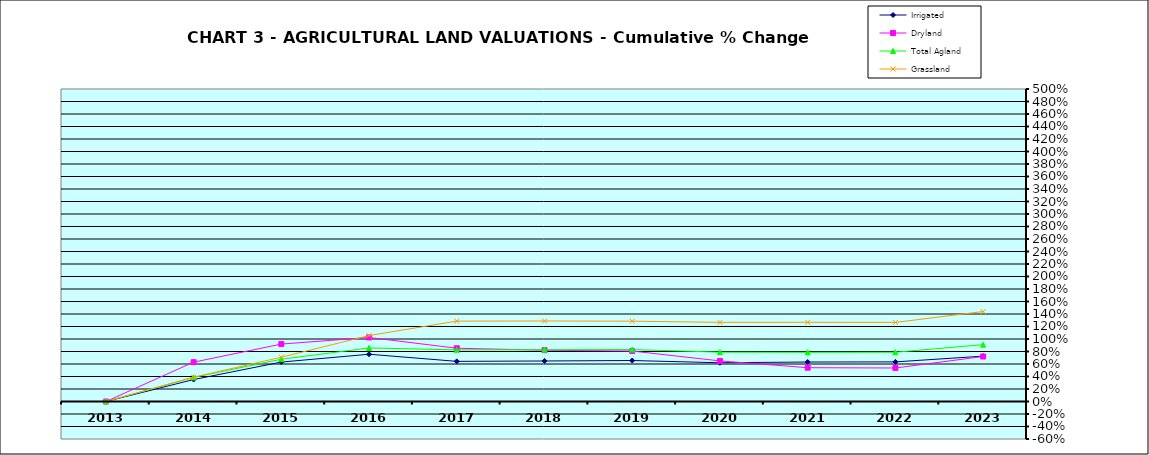
| Category | Irrigated | Dryland | Total Agland | Grassland |
|---|---|---|---|---|
| 2013.0 | 0 | 0 | 0 | 0 |
| 2014.0 | 0.351 | 0.629 | 0.385 | 0.389 |
| 2015.0 | 0.631 | 0.919 | 0.676 | 0.708 |
| 2016.0 | 0.756 | 1.025 | 0.857 | 1.055 |
| 2017.0 | 0.642 | 0.852 | 0.826 | 1.286 |
| 2018.0 | 0.648 | 0.821 | 0.828 | 1.288 |
| 2019.0 | 0.656 | 0.807 | 0.831 | 1.285 |
| 2020.0 | 0.62 | 0.649 | 0.789 | 1.266 |
| 2021.0 | 0.632 | 0.541 | 0.787 | 1.267 |
| 2022.0 | 0.634 | 0.536 | 0.788 | 1.265 |
| 2023.0 | 0.726 | 0.72 | 0.909 | 1.439 |